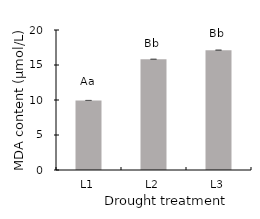
| Category | MDA |
|---|---|
| L1 | 9.935 |
| L2 | 15.817 |
| L3 | 17.118 |